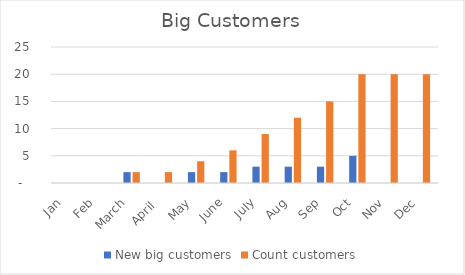
| Category | New big customers | Count customers |
|---|---|---|
|  Jan  | 0 | 0 |
|  Feb  | 0 | 0 |
|  March  | 2 | 2 |
|  April   | 0 | 2 |
|  May  | 2 | 4 |
|  June  | 2 | 6 |
|  July  | 3 | 9 |
|  Aug  | 3 | 12 |
|  Sep  | 3 | 15 |
|  Oct  | 5 | 20 |
|  Nov  | 0 | 20 |
|  Dec  | 0 | 20 |